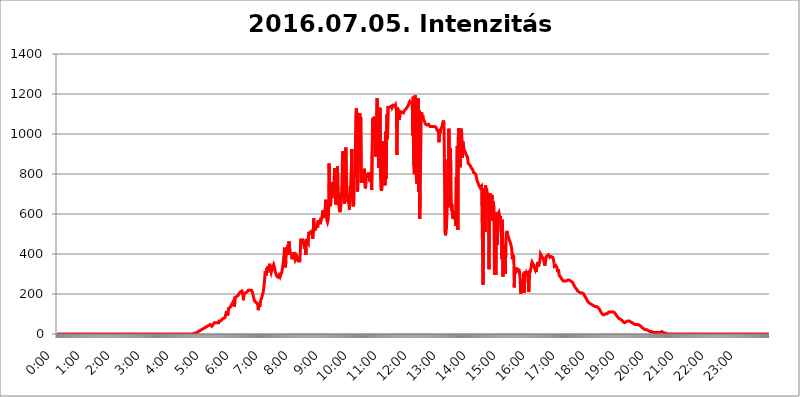
| Category | 2016.07.05. Intenzitás [W/m^2] |
|---|---|
| 0.0 | 0 |
| 0.0006944444444444445 | 0 |
| 0.001388888888888889 | 0 |
| 0.0020833333333333333 | 0 |
| 0.002777777777777778 | 0 |
| 0.003472222222222222 | 0 |
| 0.004166666666666667 | 0 |
| 0.004861111111111111 | 0 |
| 0.005555555555555556 | 0 |
| 0.0062499999999999995 | 0 |
| 0.006944444444444444 | 0 |
| 0.007638888888888889 | 0 |
| 0.008333333333333333 | 0 |
| 0.009027777777777779 | 0 |
| 0.009722222222222222 | 0 |
| 0.010416666666666666 | 0 |
| 0.011111111111111112 | 0 |
| 0.011805555555555555 | 0 |
| 0.012499999999999999 | 0 |
| 0.013194444444444444 | 0 |
| 0.013888888888888888 | 0 |
| 0.014583333333333332 | 0 |
| 0.015277777777777777 | 0 |
| 0.015972222222222224 | 0 |
| 0.016666666666666666 | 0 |
| 0.017361111111111112 | 0 |
| 0.018055555555555557 | 0 |
| 0.01875 | 0 |
| 0.019444444444444445 | 0 |
| 0.02013888888888889 | 0 |
| 0.020833333333333332 | 0 |
| 0.02152777777777778 | 0 |
| 0.022222222222222223 | 0 |
| 0.02291666666666667 | 0 |
| 0.02361111111111111 | 0 |
| 0.024305555555555556 | 0 |
| 0.024999999999999998 | 0 |
| 0.025694444444444447 | 0 |
| 0.02638888888888889 | 0 |
| 0.027083333333333334 | 0 |
| 0.027777777777777776 | 0 |
| 0.02847222222222222 | 0 |
| 0.029166666666666664 | 0 |
| 0.029861111111111113 | 0 |
| 0.030555555555555555 | 0 |
| 0.03125 | 0 |
| 0.03194444444444445 | 0 |
| 0.03263888888888889 | 0 |
| 0.03333333333333333 | 0 |
| 0.034027777777777775 | 0 |
| 0.034722222222222224 | 0 |
| 0.035416666666666666 | 0 |
| 0.036111111111111115 | 0 |
| 0.03680555555555556 | 0 |
| 0.0375 | 0 |
| 0.03819444444444444 | 0 |
| 0.03888888888888889 | 0 |
| 0.03958333333333333 | 0 |
| 0.04027777777777778 | 0 |
| 0.04097222222222222 | 0 |
| 0.041666666666666664 | 0 |
| 0.042361111111111106 | 0 |
| 0.04305555555555556 | 0 |
| 0.043750000000000004 | 0 |
| 0.044444444444444446 | 0 |
| 0.04513888888888889 | 0 |
| 0.04583333333333334 | 0 |
| 0.04652777777777778 | 0 |
| 0.04722222222222222 | 0 |
| 0.04791666666666666 | 0 |
| 0.04861111111111111 | 0 |
| 0.049305555555555554 | 0 |
| 0.049999999999999996 | 0 |
| 0.05069444444444445 | 0 |
| 0.051388888888888894 | 0 |
| 0.052083333333333336 | 0 |
| 0.05277777777777778 | 0 |
| 0.05347222222222222 | 0 |
| 0.05416666666666667 | 0 |
| 0.05486111111111111 | 0 |
| 0.05555555555555555 | 0 |
| 0.05625 | 0 |
| 0.05694444444444444 | 0 |
| 0.057638888888888885 | 0 |
| 0.05833333333333333 | 0 |
| 0.05902777777777778 | 0 |
| 0.059722222222222225 | 0 |
| 0.06041666666666667 | 0 |
| 0.061111111111111116 | 0 |
| 0.06180555555555556 | 0 |
| 0.0625 | 0 |
| 0.06319444444444444 | 0 |
| 0.06388888888888888 | 0 |
| 0.06458333333333334 | 0 |
| 0.06527777777777778 | 0 |
| 0.06597222222222222 | 0 |
| 0.06666666666666667 | 0 |
| 0.06736111111111111 | 0 |
| 0.06805555555555555 | 0 |
| 0.06874999999999999 | 0 |
| 0.06944444444444443 | 0 |
| 0.07013888888888889 | 0 |
| 0.07083333333333333 | 0 |
| 0.07152777777777779 | 0 |
| 0.07222222222222223 | 0 |
| 0.07291666666666667 | 0 |
| 0.07361111111111111 | 0 |
| 0.07430555555555556 | 0 |
| 0.075 | 0 |
| 0.07569444444444444 | 0 |
| 0.0763888888888889 | 0 |
| 0.07708333333333334 | 0 |
| 0.07777777777777778 | 0 |
| 0.07847222222222222 | 0 |
| 0.07916666666666666 | 0 |
| 0.0798611111111111 | 0 |
| 0.08055555555555556 | 0 |
| 0.08125 | 0 |
| 0.08194444444444444 | 0 |
| 0.08263888888888889 | 0 |
| 0.08333333333333333 | 0 |
| 0.08402777777777777 | 0 |
| 0.08472222222222221 | 0 |
| 0.08541666666666665 | 0 |
| 0.08611111111111112 | 0 |
| 0.08680555555555557 | 0 |
| 0.08750000000000001 | 0 |
| 0.08819444444444445 | 0 |
| 0.08888888888888889 | 0 |
| 0.08958333333333333 | 0 |
| 0.09027777777777778 | 0 |
| 0.09097222222222222 | 0 |
| 0.09166666666666667 | 0 |
| 0.09236111111111112 | 0 |
| 0.09305555555555556 | 0 |
| 0.09375 | 0 |
| 0.09444444444444444 | 0 |
| 0.09513888888888888 | 0 |
| 0.09583333333333333 | 0 |
| 0.09652777777777777 | 0 |
| 0.09722222222222222 | 0 |
| 0.09791666666666667 | 0 |
| 0.09861111111111111 | 0 |
| 0.09930555555555555 | 0 |
| 0.09999999999999999 | 0 |
| 0.10069444444444443 | 0 |
| 0.1013888888888889 | 0 |
| 0.10208333333333335 | 0 |
| 0.10277777777777779 | 0 |
| 0.10347222222222223 | 0 |
| 0.10416666666666667 | 0 |
| 0.10486111111111111 | 0 |
| 0.10555555555555556 | 0 |
| 0.10625 | 0 |
| 0.10694444444444444 | 0 |
| 0.1076388888888889 | 0 |
| 0.10833333333333334 | 0 |
| 0.10902777777777778 | 0 |
| 0.10972222222222222 | 0 |
| 0.1111111111111111 | 0 |
| 0.11180555555555556 | 0 |
| 0.11180555555555556 | 0 |
| 0.1125 | 0 |
| 0.11319444444444444 | 0 |
| 0.11388888888888889 | 0 |
| 0.11458333333333333 | 0 |
| 0.11527777777777777 | 0 |
| 0.11597222222222221 | 0 |
| 0.11666666666666665 | 0 |
| 0.1173611111111111 | 0 |
| 0.11805555555555557 | 0 |
| 0.11944444444444445 | 0 |
| 0.12013888888888889 | 0 |
| 0.12083333333333333 | 0 |
| 0.12152777777777778 | 0 |
| 0.12222222222222223 | 0 |
| 0.12291666666666667 | 0 |
| 0.12291666666666667 | 0 |
| 0.12361111111111112 | 0 |
| 0.12430555555555556 | 0 |
| 0.125 | 0 |
| 0.12569444444444444 | 0 |
| 0.12638888888888888 | 0 |
| 0.12708333333333333 | 0 |
| 0.16875 | 0 |
| 0.12847222222222224 | 0 |
| 0.12916666666666668 | 0 |
| 0.12986111111111112 | 0 |
| 0.13055555555555556 | 0 |
| 0.13125 | 0 |
| 0.13194444444444445 | 0 |
| 0.1326388888888889 | 0 |
| 0.13333333333333333 | 0 |
| 0.13402777777777777 | 0 |
| 0.13402777777777777 | 0 |
| 0.13472222222222222 | 0 |
| 0.13541666666666666 | 0 |
| 0.1361111111111111 | 0 |
| 0.13749999999999998 | 0 |
| 0.13819444444444443 | 0 |
| 0.1388888888888889 | 0 |
| 0.13958333333333334 | 0 |
| 0.14027777777777778 | 0 |
| 0.14097222222222222 | 0 |
| 0.14166666666666666 | 0 |
| 0.1423611111111111 | 0 |
| 0.14305555555555557 | 0 |
| 0.14375000000000002 | 0 |
| 0.14444444444444446 | 0 |
| 0.1451388888888889 | 0 |
| 0.1451388888888889 | 0 |
| 0.14652777777777778 | 0 |
| 0.14722222222222223 | 0 |
| 0.14791666666666667 | 0 |
| 0.1486111111111111 | 0 |
| 0.14930555555555555 | 0 |
| 0.15 | 0 |
| 0.15069444444444444 | 0 |
| 0.15138888888888888 | 0 |
| 0.15208333333333332 | 0 |
| 0.15277777777777776 | 0 |
| 0.15347222222222223 | 0 |
| 0.15416666666666667 | 0 |
| 0.15486111111111112 | 0 |
| 0.15555555555555556 | 0 |
| 0.15625 | 0 |
| 0.15694444444444444 | 0 |
| 0.15763888888888888 | 0 |
| 0.15833333333333333 | 0 |
| 0.15902777777777777 | 0 |
| 0.15972222222222224 | 0 |
| 0.16041666666666668 | 0 |
| 0.16111111111111112 | 0 |
| 0.16180555555555556 | 0 |
| 0.1625 | 0 |
| 0.16319444444444445 | 0 |
| 0.1638888888888889 | 0 |
| 0.16458333333333333 | 0 |
| 0.16527777777777777 | 0 |
| 0.16597222222222222 | 0 |
| 0.16666666666666666 | 0 |
| 0.1673611111111111 | 0 |
| 0.16805555555555554 | 0 |
| 0.16874999999999998 | 0 |
| 0.16944444444444443 | 0 |
| 0.17013888888888887 | 0 |
| 0.1708333333333333 | 0 |
| 0.17152777777777775 | 0 |
| 0.17222222222222225 | 0 |
| 0.1729166666666667 | 0 |
| 0.17361111111111113 | 0 |
| 0.17430555555555557 | 0 |
| 0.17500000000000002 | 0 |
| 0.17569444444444446 | 0 |
| 0.1763888888888889 | 0 |
| 0.17708333333333334 | 0 |
| 0.17777777777777778 | 0 |
| 0.17847222222222223 | 0 |
| 0.17916666666666667 | 0 |
| 0.1798611111111111 | 0 |
| 0.18055555555555555 | 0 |
| 0.18125 | 0 |
| 0.18194444444444444 | 0 |
| 0.1826388888888889 | 0 |
| 0.18333333333333335 | 0 |
| 0.1840277777777778 | 0 |
| 0.18472222222222223 | 0 |
| 0.18541666666666667 | 0 |
| 0.18611111111111112 | 0 |
| 0.18680555555555556 | 0 |
| 0.1875 | 0 |
| 0.18819444444444444 | 0 |
| 0.18888888888888888 | 0 |
| 0.18958333333333333 | 0 |
| 0.19027777777777777 | 3.525 |
| 0.1909722222222222 | 3.525 |
| 0.19166666666666665 | 3.525 |
| 0.19236111111111112 | 3.525 |
| 0.19305555555555554 | 3.525 |
| 0.19375 | 3.525 |
| 0.19444444444444445 | 7.887 |
| 0.1951388888888889 | 7.887 |
| 0.19583333333333333 | 7.887 |
| 0.19652777777777777 | 7.887 |
| 0.19722222222222222 | 7.887 |
| 0.19791666666666666 | 12.257 |
| 0.1986111111111111 | 12.257 |
| 0.19930555555555554 | 12.257 |
| 0.19999999999999998 | 16.636 |
| 0.20069444444444443 | 16.636 |
| 0.20138888888888887 | 21.024 |
| 0.2020833333333333 | 21.024 |
| 0.2027777777777778 | 21.024 |
| 0.2034722222222222 | 21.024 |
| 0.2041666666666667 | 25.419 |
| 0.20486111111111113 | 25.419 |
| 0.20555555555555557 | 29.823 |
| 0.20625000000000002 | 29.823 |
| 0.20694444444444446 | 34.234 |
| 0.2076388888888889 | 34.234 |
| 0.20833333333333334 | 34.234 |
| 0.20902777777777778 | 38.653 |
| 0.20972222222222223 | 38.653 |
| 0.21041666666666667 | 38.653 |
| 0.2111111111111111 | 38.653 |
| 0.21180555555555555 | 43.079 |
| 0.2125 | 43.079 |
| 0.21319444444444444 | 43.079 |
| 0.2138888888888889 | 47.511 |
| 0.21458333333333335 | 47.511 |
| 0.2152777777777778 | 43.079 |
| 0.21597222222222223 | 43.079 |
| 0.21666666666666667 | 38.653 |
| 0.21736111111111112 | 43.079 |
| 0.21805555555555556 | 43.079 |
| 0.21875 | 47.511 |
| 0.21944444444444444 | 51.951 |
| 0.22013888888888888 | 56.398 |
| 0.22083333333333333 | 56.398 |
| 0.22152777777777777 | 56.398 |
| 0.2222222222222222 | 56.398 |
| 0.22291666666666665 | 56.398 |
| 0.2236111111111111 | 56.398 |
| 0.22430555555555556 | 56.398 |
| 0.225 | 56.398 |
| 0.22569444444444445 | 56.398 |
| 0.2263888888888889 | 56.398 |
| 0.22708333333333333 | 65.31 |
| 0.22777777777777777 | 60.85 |
| 0.22847222222222222 | 65.31 |
| 0.22916666666666666 | 65.31 |
| 0.2298611111111111 | 69.775 |
| 0.23055555555555554 | 69.775 |
| 0.23124999999999998 | 74.246 |
| 0.23194444444444443 | 74.246 |
| 0.23263888888888887 | 74.246 |
| 0.2333333333333333 | 78.722 |
| 0.2340277777777778 | 78.722 |
| 0.2347222222222222 | 78.722 |
| 0.2354166666666667 | 83.205 |
| 0.23611111111111113 | 83.205 |
| 0.23680555555555557 | 105.69 |
| 0.23750000000000002 | 114.716 |
| 0.23819444444444446 | 114.716 |
| 0.2388888888888889 | 92.184 |
| 0.23958333333333334 | 101.184 |
| 0.24027777777777778 | 128.284 |
| 0.24097222222222223 | 128.284 |
| 0.24166666666666667 | 128.284 |
| 0.2423611111111111 | 132.814 |
| 0.24305555555555555 | 132.814 |
| 0.24375 | 141.884 |
| 0.24444444444444446 | 146.423 |
| 0.24513888888888888 | 150.964 |
| 0.24583333333333335 | 155.509 |
| 0.2465277777777778 | 160.056 |
| 0.24722222222222223 | 155.509 |
| 0.24791666666666667 | 160.056 |
| 0.24861111111111112 | 137.347 |
| 0.24930555555555556 | 182.82 |
| 0.25 | 182.82 |
| 0.25069444444444444 | 187.378 |
| 0.2513888888888889 | 187.378 |
| 0.2520833333333333 | 191.937 |
| 0.25277777777777777 | 191.937 |
| 0.2534722222222222 | 191.937 |
| 0.25416666666666665 | 196.497 |
| 0.2548611111111111 | 201.058 |
| 0.2555555555555556 | 201.058 |
| 0.25625000000000003 | 205.62 |
| 0.2569444444444445 | 210.182 |
| 0.2576388888888889 | 214.746 |
| 0.25833333333333336 | 210.182 |
| 0.2590277777777778 | 214.746 |
| 0.25972222222222224 | 210.182 |
| 0.2604166666666667 | 191.937 |
| 0.2611111111111111 | 169.156 |
| 0.26180555555555557 | 201.058 |
| 0.2625 | 196.497 |
| 0.26319444444444445 | 205.62 |
| 0.2638888888888889 | 205.62 |
| 0.26458333333333334 | 201.058 |
| 0.2652777777777778 | 205.62 |
| 0.2659722222222222 | 210.182 |
| 0.26666666666666666 | 210.182 |
| 0.2673611111111111 | 214.746 |
| 0.26805555555555555 | 219.309 |
| 0.26875 | 219.309 |
| 0.26944444444444443 | 223.873 |
| 0.2701388888888889 | 219.309 |
| 0.2708333333333333 | 223.873 |
| 0.27152777777777776 | 219.309 |
| 0.2722222222222222 | 219.309 |
| 0.27291666666666664 | 214.746 |
| 0.2736111111111111 | 210.182 |
| 0.2743055555555555 | 201.058 |
| 0.27499999999999997 | 187.378 |
| 0.27569444444444446 | 178.264 |
| 0.27638888888888885 | 169.156 |
| 0.27708333333333335 | 164.605 |
| 0.2777777777777778 | 160.056 |
| 0.27847222222222223 | 155.509 |
| 0.2791666666666667 | 155.509 |
| 0.2798611111111111 | 155.509 |
| 0.28055555555555556 | 155.509 |
| 0.28125 | 146.423 |
| 0.28194444444444444 | 119.235 |
| 0.2826388888888889 | 123.758 |
| 0.2833333333333333 | 150.964 |
| 0.28402777777777777 | 137.347 |
| 0.2847222222222222 | 160.056 |
| 0.28541666666666665 | 169.156 |
| 0.28611111111111115 | 173.709 |
| 0.28680555555555554 | 182.82 |
| 0.28750000000000003 | 191.937 |
| 0.2881944444444445 | 201.058 |
| 0.2888888888888889 | 210.182 |
| 0.28958333333333336 | 228.436 |
| 0.2902777777777778 | 251.251 |
| 0.29097222222222224 | 278.603 |
| 0.2916666666666667 | 314.98 |
| 0.2923611111111111 | 305.898 |
| 0.29305555555555557 | 292.259 |
| 0.29375 | 328.584 |
| 0.29444444444444445 | 305.898 |
| 0.2951388888888889 | 337.639 |
| 0.29583333333333334 | 333.113 |
| 0.2965277777777778 | 314.98 |
| 0.2972222222222222 | 337.639 |
| 0.29791666666666666 | 351.198 |
| 0.2986111111111111 | 346.682 |
| 0.29930555555555555 | 314.98 |
| 0.3 | 305.898 |
| 0.30069444444444443 | 314.98 |
| 0.3013888888888889 | 324.052 |
| 0.3020833333333333 | 333.113 |
| 0.30277777777777776 | 333.113 |
| 0.3034722222222222 | 346.682 |
| 0.30416666666666664 | 342.162 |
| 0.3048611111111111 | 328.584 |
| 0.3055555555555555 | 324.052 |
| 0.30624999999999997 | 305.898 |
| 0.3069444444444444 | 296.808 |
| 0.3076388888888889 | 292.259 |
| 0.30833333333333335 | 287.709 |
| 0.3090277777777778 | 287.709 |
| 0.30972222222222223 | 283.156 |
| 0.3104166666666667 | 283.156 |
| 0.3111111111111111 | 287.709 |
| 0.31180555555555556 | 287.709 |
| 0.3125 | 305.898 |
| 0.31319444444444444 | 292.259 |
| 0.3138888888888889 | 296.808 |
| 0.3145833333333333 | 305.898 |
| 0.31527777777777777 | 314.98 |
| 0.3159722222222222 | 333.113 |
| 0.31666666666666665 | 346.682 |
| 0.31736111111111115 | 342.162 |
| 0.31805555555555554 | 396.164 |
| 0.31875000000000003 | 431.833 |
| 0.3194444444444445 | 342.162 |
| 0.3201388888888889 | 333.113 |
| 0.32083333333333336 | 405.108 |
| 0.3215277777777778 | 418.492 |
| 0.32222222222222224 | 427.39 |
| 0.3229166666666667 | 431.833 |
| 0.3236111111111111 | 445.129 |
| 0.32430555555555557 | 396.164 |
| 0.325 | 462.786 |
| 0.32569444444444445 | 462.786 |
| 0.3263888888888889 | 409.574 |
| 0.32708333333333334 | 414.035 |
| 0.3277777777777778 | 414.035 |
| 0.3284722222222222 | 396.164 |
| 0.32916666666666666 | 373.729 |
| 0.3298611111111111 | 369.23 |
| 0.33055555555555555 | 373.729 |
| 0.33125 | 391.685 |
| 0.33194444444444443 | 409.574 |
| 0.3326388888888889 | 405.108 |
| 0.3333333333333333 | 387.202 |
| 0.3340277777777778 | 369.23 |
| 0.3347222222222222 | 373.729 |
| 0.3354166666666667 | 378.224 |
| 0.3361111111111111 | 387.202 |
| 0.3368055555555556 | 387.202 |
| 0.33749999999999997 | 373.729 |
| 0.33819444444444446 | 364.728 |
| 0.33888888888888885 | 360.221 |
| 0.33958333333333335 | 369.23 |
| 0.34027777777777773 | 364.728 |
| 0.34097222222222223 | 364.728 |
| 0.3416666666666666 | 475.972 |
| 0.3423611111111111 | 449.551 |
| 0.3430555555555555 | 462.786 |
| 0.34375 | 475.972 |
| 0.3444444444444445 | 475.972 |
| 0.3451388888888889 | 471.582 |
| 0.3458333333333334 | 449.551 |
| 0.34652777777777777 | 427.39 |
| 0.34722222222222227 | 431.833 |
| 0.34791666666666665 | 462.786 |
| 0.34861111111111115 | 396.164 |
| 0.34930555555555554 | 475.972 |
| 0.35000000000000003 | 467.187 |
| 0.3506944444444444 | 467.187 |
| 0.3513888888888889 | 471.582 |
| 0.3520833333333333 | 453.968 |
| 0.3527777777777778 | 510.885 |
| 0.3534722222222222 | 502.192 |
| 0.3541666666666667 | 502.192 |
| 0.3548611111111111 | 506.542 |
| 0.35555555555555557 | 510.885 |
| 0.35625 | 510.885 |
| 0.35694444444444445 | 515.223 |
| 0.3576388888888889 | 493.475 |
| 0.35833333333333334 | 475.972 |
| 0.3590277777777778 | 515.223 |
| 0.3597222222222222 | 579.542 |
| 0.36041666666666666 | 519.555 |
| 0.3611111111111111 | 515.223 |
| 0.36180555555555555 | 523.88 |
| 0.3625 | 523.88 |
| 0.36319444444444443 | 536.82 |
| 0.3638888888888889 | 532.513 |
| 0.3645833333333333 | 545.416 |
| 0.3652777777777778 | 532.513 |
| 0.3659722222222222 | 566.793 |
| 0.3666666666666667 | 549.704 |
| 0.3673611111111111 | 549.704 |
| 0.3680555555555556 | 562.53 |
| 0.36874999999999997 | 549.704 |
| 0.36944444444444446 | 558.261 |
| 0.37013888888888885 | 553.986 |
| 0.37083333333333335 | 562.53 |
| 0.37152777777777773 | 588.009 |
| 0.37222222222222223 | 617.436 |
| 0.3729166666666666 | 600.661 |
| 0.3736111111111111 | 588.009 |
| 0.3743055555555555 | 579.542 |
| 0.375 | 604.864 |
| 0.3756944444444445 | 621.613 |
| 0.3763888888888889 | 671.22 |
| 0.3770833333333334 | 592.233 |
| 0.37777777777777777 | 583.779 |
| 0.37847222222222227 | 566.793 |
| 0.37916666666666665 | 558.261 |
| 0.37986111111111115 | 566.793 |
| 0.38055555555555554 | 604.864 |
| 0.38125000000000003 | 853.029 |
| 0.3819444444444444 | 679.395 |
| 0.3826388888888889 | 683.473 |
| 0.3833333333333333 | 638.256 |
| 0.3840277777777778 | 715.858 |
| 0.3847222222222222 | 691.608 |
| 0.3854166666666667 | 679.395 |
| 0.3861111111111111 | 759.723 |
| 0.38680555555555557 | 739.877 |
| 0.3875 | 723.889 |
| 0.38819444444444445 | 695.666 |
| 0.3888888888888889 | 829.981 |
| 0.38958333333333334 | 751.803 |
| 0.3902777777777778 | 663.019 |
| 0.3909722222222222 | 646.537 |
| 0.39166666666666666 | 787.258 |
| 0.3923611111111111 | 739.877 |
| 0.39305555555555555 | 837.682 |
| 0.39375 | 715.858 |
| 0.39444444444444443 | 699.717 |
| 0.3951388888888889 | 642.4 |
| 0.3958333333333333 | 617.436 |
| 0.3965277777777778 | 609.062 |
| 0.3972222222222222 | 625.784 |
| 0.3979166666666667 | 642.4 |
| 0.3986111111111111 | 691.608 |
| 0.3993055555555556 | 743.859 |
| 0.39999999999999997 | 894.885 |
| 0.40069444444444446 | 913.766 |
| 0.40138888888888885 | 767.62 |
| 0.40208333333333335 | 695.666 |
| 0.40277777777777773 | 650.667 |
| 0.40347222222222223 | 719.877 |
| 0.4041666666666666 | 913.766 |
| 0.4048611111111111 | 932.576 |
| 0.4055555555555555 | 775.492 |
| 0.40625 | 719.877 |
| 0.4069444444444445 | 695.666 |
| 0.4076388888888889 | 658.909 |
| 0.4083333333333334 | 671.22 |
| 0.40902777777777777 | 650.667 |
| 0.40972222222222227 | 621.613 |
| 0.41041666666666665 | 658.909 |
| 0.41111111111111115 | 739.877 |
| 0.41180555555555554 | 723.889 |
| 0.41250000000000003 | 727.896 |
| 0.4131944444444444 | 925.06 |
| 0.4138888888888889 | 679.395 |
| 0.4145833333333333 | 687.544 |
| 0.4152777777777778 | 638.256 |
| 0.4159722222222222 | 650.667 |
| 0.4166666666666667 | 779.42 |
| 0.4173611111111111 | 802.868 |
| 0.41805555555555557 | 868.305 |
| 0.41875 | 1089.873 |
| 0.41944444444444445 | 1127.879 |
| 0.4201388888888889 | 1101.226 |
| 0.42083333333333334 | 711.832 |
| 0.4215277777777778 | 723.889 |
| 0.4222222222222222 | 822.26 |
| 0.42291666666666666 | 970.034 |
| 0.4236111111111111 | 1052.255 |
| 0.42430555555555555 | 1105.019 |
| 0.425 | 1056.004 |
| 0.42569444444444443 | 1082.324 |
| 0.4263888888888889 | 755.766 |
| 0.4270833333333333 | 810.641 |
| 0.4277777777777778 | 763.674 |
| 0.4284722222222222 | 798.974 |
| 0.4291666666666667 | 771.559 |
| 0.4298611111111111 | 755.766 |
| 0.4305555555555556 | 826.123 |
| 0.43124999999999997 | 763.674 |
| 0.43194444444444446 | 727.896 |
| 0.43263888888888885 | 735.89 |
| 0.43333333333333335 | 779.42 |
| 0.43402777777777773 | 779.42 |
| 0.43472222222222223 | 802.868 |
| 0.4354166666666666 | 802.868 |
| 0.4361111111111111 | 783.342 |
| 0.4368055555555555 | 806.757 |
| 0.4375 | 791.169 |
| 0.4381944444444445 | 767.62 |
| 0.4388888888888889 | 759.723 |
| 0.4395833333333334 | 759.723 |
| 0.44027777777777777 | 810.641 |
| 0.44097222222222227 | 719.877 |
| 0.44166666666666665 | 913.766 |
| 0.44236111111111115 | 1078.555 |
| 0.44305555555555554 | 999.916 |
| 0.44375000000000003 | 977.508 |
| 0.4444444444444444 | 1086.097 |
| 0.4451388888888889 | 1082.324 |
| 0.4458333333333333 | 925.06 |
| 0.4465277777777778 | 887.309 |
| 0.4472222222222222 | 1014.852 |
| 0.4479166666666667 | 1014.852 |
| 0.4486111111111111 | 1178.177 |
| 0.44930555555555557 | 1048.508 |
| 0.45 | 970.034 |
| 0.45069444444444445 | 829.981 |
| 0.4513888888888889 | 913.766 |
| 0.45208333333333334 | 1078.555 |
| 0.4527777777777778 | 1131.708 |
| 0.4534722222222222 | 783.342 |
| 0.45416666666666666 | 723.889 |
| 0.4548611111111111 | 715.858 |
| 0.45555555555555555 | 751.803 |
| 0.45625 | 940.082 |
| 0.45694444444444443 | 962.555 |
| 0.4576388888888889 | 936.33 |
| 0.4583333333333333 | 802.868 |
| 0.4590277777777778 | 902.447 |
| 0.4597222222222222 | 743.859 |
| 0.4604166666666667 | 1011.118 |
| 0.4611111111111111 | 775.492 |
| 0.4618055555555556 | 1029.798 |
| 0.46249999999999997 | 1097.437 |
| 0.46319444444444446 | 973.772 |
| 0.46388888888888885 | 1139.384 |
| 0.46458333333333335 | 1131.708 |
| 0.46527777777777773 | 1131.708 |
| 0.46597222222222223 | 1131.708 |
| 0.4666666666666666 | 1135.543 |
| 0.4673611111111111 | 1135.543 |
| 0.4680555555555555 | 1139.384 |
| 0.46875 | 1139.384 |
| 0.4694444444444445 | 1131.708 |
| 0.4701388888888889 | 1135.543 |
| 0.4708333333333334 | 1143.232 |
| 0.47152777777777777 | 1139.384 |
| 0.47222222222222227 | 1143.232 |
| 0.47291666666666665 | 1139.384 |
| 0.47361111111111115 | 1135.543 |
| 0.47430555555555554 | 1147.086 |
| 0.47500000000000003 | 1143.232 |
| 0.4756944444444444 | 1116.426 |
| 0.4763888888888889 | 894.885 |
| 0.4770833333333333 | 1131.708 |
| 0.4777777777777778 | 1124.056 |
| 0.4784722222222222 | 1116.426 |
| 0.4791666666666667 | 1116.426 |
| 0.4798611111111111 | 1071.027 |
| 0.48055555555555557 | 1101.226 |
| 0.48125 | 1112.618 |
| 0.48194444444444445 | 1112.618 |
| 0.4826388888888889 | 1108.816 |
| 0.48333333333333334 | 1108.816 |
| 0.4840277777777778 | 1108.816 |
| 0.4847222222222222 | 1108.816 |
| 0.48541666666666666 | 1105.019 |
| 0.4861111111111111 | 1108.816 |
| 0.48680555555555555 | 1116.426 |
| 0.4875 | 1116.426 |
| 0.48819444444444443 | 1116.426 |
| 0.4888888888888889 | 1124.056 |
| 0.4895833333333333 | 1124.056 |
| 0.4902777777777778 | 1127.879 |
| 0.4909722222222222 | 1135.543 |
| 0.4916666666666667 | 1139.384 |
| 0.4923611111111111 | 1143.232 |
| 0.4930555555555556 | 1150.946 |
| 0.49374999999999997 | 1154.814 |
| 0.49444444444444446 | 1162.571 |
| 0.49513888888888885 | 1162.571 |
| 0.49583333333333335 | 1154.814 |
| 0.49652777777777773 | 1158.689 |
| 0.49722222222222223 | 1150.946 |
| 0.4979166666666666 | 1154.814 |
| 0.4986111111111111 | 992.448 |
| 0.4993055555555555 | 1186.03 |
| 0.5 | 845.365 |
| 0.5006944444444444 | 798.974 |
| 0.5013888888888889 | 826.123 |
| 0.5020833333333333 | 1193.918 |
| 0.5027777777777778 | 1089.873 |
| 0.5034722222222222 | 791.169 |
| 0.5041666666666667 | 751.803 |
| 0.5048611111111111 | 977.508 |
| 0.5055555555555555 | 1067.267 |
| 0.50625 | 1178.177 |
| 0.5069444444444444 | 711.832 |
| 0.5076388888888889 | 1120.238 |
| 0.5083333333333333 | 575.299 |
| 0.5090277777777777 | 695.666 |
| 0.5097222222222222 | 695.666 |
| 0.5104166666666666 | 1097.437 |
| 0.5111111111111112 | 1108.816 |
| 0.5118055555555555 | 1078.555 |
| 0.5125000000000001 | 1093.653 |
| 0.5131944444444444 | 1078.555 |
| 0.513888888888889 | 1071.027 |
| 0.5145833333333333 | 1067.267 |
| 0.5152777777777778 | 1059.756 |
| 0.5159722222222222 | 1056.004 |
| 0.5166666666666667 | 1048.508 |
| 0.517361111111111 | 1048.508 |
| 0.5180555555555556 | 1044.762 |
| 0.5187499999999999 | 1044.762 |
| 0.5194444444444445 | 1044.762 |
| 0.5201388888888888 | 1048.508 |
| 0.5208333333333334 | 1048.508 |
| 0.5215277777777778 | 1048.508 |
| 0.5222222222222223 | 1044.762 |
| 0.5229166666666667 | 1037.277 |
| 0.5236111111111111 | 1033.537 |
| 0.5243055555555556 | 1037.277 |
| 0.525 | 1037.277 |
| 0.5256944444444445 | 1037.277 |
| 0.5263888888888889 | 1037.277 |
| 0.5270833333333333 | 1037.277 |
| 0.5277777777777778 | 1037.277 |
| 0.5284722222222222 | 1037.277 |
| 0.5291666666666667 | 1037.277 |
| 0.5298611111111111 | 1037.277 |
| 0.5305555555555556 | 1037.277 |
| 0.53125 | 1033.537 |
| 0.5319444444444444 | 1029.798 |
| 0.5326388888888889 | 1018.587 |
| 0.5333333333333333 | 1018.587 |
| 0.5340277777777778 | 1022.323 |
| 0.5347222222222222 | 1018.587 |
| 0.5354166666666667 | 958.814 |
| 0.5361111111111111 | 1014.852 |
| 0.5368055555555555 | 1003.65 |
| 0.5375 | 1018.587 |
| 0.5381944444444444 | 1026.06 |
| 0.5388888888888889 | 1029.798 |
| 0.5395833333333333 | 1037.277 |
| 0.5402777777777777 | 1048.508 |
| 0.5409722222222222 | 1059.756 |
| 0.5416666666666666 | 1067.267 |
| 0.5423611111111112 | 1052.255 |
| 0.5430555555555555 | 868.305 |
| 0.5437500000000001 | 515.223 |
| 0.5444444444444444 | 493.475 |
| 0.545138888888889 | 510.885 |
| 0.5458333333333333 | 528.2 |
| 0.5465277777777778 | 592.233 |
| 0.5472222222222222 | 675.311 |
| 0.5479166666666667 | 872.114 |
| 0.548611111111111 | 634.105 |
| 0.5493055555555556 | 1026.06 |
| 0.5499999999999999 | 687.544 |
| 0.5506944444444445 | 658.909 |
| 0.5513888888888888 | 928.819 |
| 0.5520833333333334 | 802.868 |
| 0.5527777777777778 | 617.436 |
| 0.5534722222222223 | 650.667 |
| 0.5541666666666667 | 609.062 |
| 0.5548611111111111 | 575.299 |
| 0.5555555555555556 | 592.233 |
| 0.55625 | 613.252 |
| 0.5569444444444445 | 592.233 |
| 0.5576388888888889 | 609.062 |
| 0.5583333333333333 | 571.049 |
| 0.5590277777777778 | 541.121 |
| 0.5597222222222222 | 783.342 |
| 0.5604166666666667 | 743.859 |
| 0.5611111111111111 | 940.082 |
| 0.5618055555555556 | 519.555 |
| 0.5625 | 984.98 |
| 0.5631944444444444 | 1029.798 |
| 0.5638888888888889 | 1029.798 |
| 0.5645833333333333 | 1033.537 |
| 0.5652777777777778 | 833.834 |
| 0.5659722222222222 | 1026.06 |
| 0.5666666666666667 | 1018.587 |
| 0.5673611111111111 | 1003.65 |
| 0.5680555555555555 | 879.719 |
| 0.56875 | 962.555 |
| 0.5694444444444444 | 951.327 |
| 0.5701388888888889 | 932.576 |
| 0.5708333333333333 | 917.534 |
| 0.5715277777777777 | 917.534 |
| 0.5722222222222222 | 909.996 |
| 0.5729166666666666 | 902.447 |
| 0.5736111111111112 | 894.885 |
| 0.5743055555555555 | 891.099 |
| 0.5750000000000001 | 887.309 |
| 0.5756944444444444 | 875.918 |
| 0.576388888888889 | 853.029 |
| 0.5770833333333333 | 856.855 |
| 0.5777777777777778 | 849.199 |
| 0.5784722222222222 | 845.365 |
| 0.5791666666666667 | 841.526 |
| 0.579861111111111 | 837.682 |
| 0.5805555555555556 | 829.981 |
| 0.5812499999999999 | 829.981 |
| 0.5819444444444445 | 826.123 |
| 0.5826388888888888 | 822.26 |
| 0.5833333333333334 | 814.519 |
| 0.5840277777777778 | 806.757 |
| 0.5847222222222223 | 802.868 |
| 0.5854166666666667 | 802.868 |
| 0.5861111111111111 | 802.868 |
| 0.5868055555555556 | 798.974 |
| 0.5875 | 791.169 |
| 0.5881944444444445 | 779.42 |
| 0.5888888888888889 | 767.62 |
| 0.5895833333333333 | 759.723 |
| 0.5902777777777778 | 755.766 |
| 0.5909722222222222 | 747.834 |
| 0.5916666666666667 | 739.877 |
| 0.5923611111111111 | 735.89 |
| 0.5930555555555556 | 731.896 |
| 0.59375 | 727.896 |
| 0.5944444444444444 | 735.89 |
| 0.5951388888888889 | 739.877 |
| 0.5958333333333333 | 739.877 |
| 0.5965277777777778 | 739.877 |
| 0.5972222222222222 | 246.689 |
| 0.5979166666666667 | 642.4 |
| 0.5986111111111111 | 719.877 |
| 0.5993055555555555 | 727.896 |
| 0.6 | 510.885 |
| 0.6006944444444444 | 743.859 |
| 0.6013888888888889 | 719.877 |
| 0.6020833333333333 | 727.896 |
| 0.6027777777777777 | 703.762 |
| 0.6034722222222222 | 679.395 |
| 0.6041666666666666 | 703.762 |
| 0.6048611111111112 | 600.661 |
| 0.6055555555555555 | 324.052 |
| 0.6062500000000001 | 695.666 |
| 0.6069444444444444 | 703.762 |
| 0.607638888888889 | 703.762 |
| 0.6083333333333333 | 699.717 |
| 0.6090277777777778 | 596.45 |
| 0.6097222222222222 | 695.666 |
| 0.6104166666666667 | 566.793 |
| 0.611111111111111 | 663.019 |
| 0.6118055555555556 | 646.537 |
| 0.6124999999999999 | 638.256 |
| 0.6131944444444445 | 296.808 |
| 0.6138888888888888 | 471.582 |
| 0.6145833333333334 | 328.584 |
| 0.6152777777777778 | 296.808 |
| 0.6159722222222223 | 609.062 |
| 0.6166666666666667 | 613.252 |
| 0.6173611111111111 | 445.129 |
| 0.6180555555555556 | 600.661 |
| 0.61875 | 604.864 |
| 0.6194444444444445 | 609.062 |
| 0.6201388888888889 | 609.062 |
| 0.6208333333333333 | 579.542 |
| 0.6215277777777778 | 588.009 |
| 0.6222222222222222 | 588.009 |
| 0.6229166666666667 | 506.542 |
| 0.6236111111111111 | 373.729 |
| 0.6243055555555556 | 571.049 |
| 0.625 | 287.709 |
| 0.6256944444444444 | 287.709 |
| 0.6263888888888889 | 378.224 |
| 0.6270833333333333 | 396.164 |
| 0.6277777777777778 | 440.702 |
| 0.6284722222222222 | 301.354 |
| 0.6291666666666667 | 449.551 |
| 0.6298611111111111 | 506.542 |
| 0.6305555555555555 | 515.223 |
| 0.63125 | 510.885 |
| 0.6319444444444444 | 493.475 |
| 0.6326388888888889 | 484.735 |
| 0.6333333333333333 | 480.356 |
| 0.6340277777777777 | 471.582 |
| 0.6347222222222222 | 462.786 |
| 0.6354166666666666 | 458.38 |
| 0.6361111111111112 | 449.551 |
| 0.6368055555555555 | 436.27 |
| 0.6375000000000001 | 422.943 |
| 0.6381944444444444 | 373.729 |
| 0.638888888888889 | 396.164 |
| 0.6395833333333333 | 391.685 |
| 0.6402777777777778 | 387.202 |
| 0.6409722222222222 | 233 |
| 0.6416666666666667 | 319.517 |
| 0.642361111111111 | 333.113 |
| 0.6430555555555556 | 324.052 |
| 0.6437499999999999 | 319.517 |
| 0.6444444444444445 | 314.98 |
| 0.6451388888888888 | 319.517 |
| 0.6458333333333334 | 324.052 |
| 0.6465277777777778 | 324.052 |
| 0.6472222222222223 | 324.052 |
| 0.6479166666666667 | 319.517 |
| 0.6486111111111111 | 314.98 |
| 0.6493055555555556 | 274.047 |
| 0.65 | 201.058 |
| 0.6506944444444445 | 264.932 |
| 0.6513888888888889 | 223.873 |
| 0.6520833333333333 | 269.49 |
| 0.6527777777777778 | 210.182 |
| 0.6534722222222222 | 205.62 |
| 0.6541666666666667 | 305.898 |
| 0.6548611111111111 | 205.62 |
| 0.6555555555555556 | 255.813 |
| 0.65625 | 314.98 |
| 0.6569444444444444 | 301.354 |
| 0.6576388888888889 | 292.259 |
| 0.6583333333333333 | 305.898 |
| 0.6590277777777778 | 310.44 |
| 0.6597222222222222 | 296.808 |
| 0.6604166666666667 | 314.98 |
| 0.6611111111111111 | 210.182 |
| 0.6618055555555555 | 219.309 |
| 0.6625 | 319.517 |
| 0.6631944444444444 | 310.44 |
| 0.6638888888888889 | 319.517 |
| 0.6645833333333333 | 333.113 |
| 0.6652777777777777 | 351.198 |
| 0.6659722222222222 | 360.221 |
| 0.6666666666666666 | 360.221 |
| 0.6673611111111111 | 355.712 |
| 0.6680555555555556 | 346.682 |
| 0.6687500000000001 | 337.639 |
| 0.6694444444444444 | 342.162 |
| 0.6701388888888888 | 324.052 |
| 0.6708333333333334 | 337.639 |
| 0.6715277777777778 | 310.44 |
| 0.6722222222222222 | 319.517 |
| 0.6729166666666666 | 346.682 |
| 0.6736111111111112 | 346.682 |
| 0.6743055555555556 | 360.221 |
| 0.6749999999999999 | 337.639 |
| 0.6756944444444444 | 346.682 |
| 0.6763888888888889 | 351.198 |
| 0.6770833333333334 | 369.23 |
| 0.6777777777777777 | 400.638 |
| 0.6784722222222223 | 396.164 |
| 0.6791666666666667 | 391.685 |
| 0.6798611111111111 | 387.202 |
| 0.6805555555555555 | 382.715 |
| 0.68125 | 387.202 |
| 0.6819444444444445 | 373.729 |
| 0.6826388888888889 | 369.23 |
| 0.6833333333333332 | 351.198 |
| 0.6840277777777778 | 342.162 |
| 0.6847222222222222 | 346.682 |
| 0.6854166666666667 | 382.715 |
| 0.686111111111111 | 387.202 |
| 0.6868055555555556 | 391.685 |
| 0.6875 | 396.164 |
| 0.6881944444444444 | 396.164 |
| 0.688888888888889 | 396.164 |
| 0.6895833333333333 | 391.685 |
| 0.6902777777777778 | 396.164 |
| 0.6909722222222222 | 382.715 |
| 0.6916666666666668 | 387.202 |
| 0.6923611111111111 | 387.202 |
| 0.6930555555555555 | 387.202 |
| 0.69375 | 387.202 |
| 0.6944444444444445 | 387.202 |
| 0.6951388888888889 | 382.715 |
| 0.6958333333333333 | 373.729 |
| 0.6965277777777777 | 360.221 |
| 0.6972222222222223 | 337.639 |
| 0.6979166666666666 | 337.639 |
| 0.6986111111111111 | 337.639 |
| 0.6993055555555556 | 342.162 |
| 0.7000000000000001 | 337.639 |
| 0.7006944444444444 | 333.113 |
| 0.7013888888888888 | 324.052 |
| 0.7020833333333334 | 310.44 |
| 0.7027777777777778 | 324.052 |
| 0.7034722222222222 | 305.898 |
| 0.7041666666666666 | 292.259 |
| 0.7048611111111112 | 296.808 |
| 0.7055555555555556 | 287.709 |
| 0.7062499999999999 | 283.156 |
| 0.7069444444444444 | 278.603 |
| 0.7076388888888889 | 274.047 |
| 0.7083333333333334 | 269.49 |
| 0.7090277777777777 | 269.49 |
| 0.7097222222222223 | 264.932 |
| 0.7104166666666667 | 264.932 |
| 0.7111111111111111 | 264.932 |
| 0.7118055555555555 | 264.932 |
| 0.7125 | 264.932 |
| 0.7131944444444445 | 264.932 |
| 0.7138888888888889 | 264.932 |
| 0.7145833333333332 | 269.49 |
| 0.7152777777777778 | 269.49 |
| 0.7159722222222222 | 269.49 |
| 0.7166666666666667 | 269.49 |
| 0.717361111111111 | 269.49 |
| 0.7180555555555556 | 269.49 |
| 0.71875 | 264.932 |
| 0.7194444444444444 | 264.932 |
| 0.720138888888889 | 264.932 |
| 0.7208333333333333 | 264.932 |
| 0.7215277777777778 | 260.373 |
| 0.7222222222222222 | 260.373 |
| 0.7229166666666668 | 255.813 |
| 0.7236111111111111 | 251.251 |
| 0.7243055555555555 | 246.689 |
| 0.725 | 242.127 |
| 0.7256944444444445 | 237.564 |
| 0.7263888888888889 | 233 |
| 0.7270833333333333 | 228.436 |
| 0.7277777777777777 | 228.436 |
| 0.7284722222222223 | 223.873 |
| 0.7291666666666666 | 219.309 |
| 0.7298611111111111 | 214.746 |
| 0.7305555555555556 | 214.746 |
| 0.7312500000000001 | 210.182 |
| 0.7319444444444444 | 210.182 |
| 0.7326388888888888 | 210.182 |
| 0.7333333333333334 | 205.62 |
| 0.7340277777777778 | 205.62 |
| 0.7347222222222222 | 205.62 |
| 0.7354166666666666 | 205.62 |
| 0.7361111111111112 | 205.62 |
| 0.7368055555555556 | 205.62 |
| 0.7374999999999999 | 201.058 |
| 0.7381944444444444 | 201.058 |
| 0.7388888888888889 | 196.497 |
| 0.7395833333333334 | 191.937 |
| 0.7402777777777777 | 187.378 |
| 0.7409722222222223 | 182.82 |
| 0.7416666666666667 | 178.264 |
| 0.7423611111111111 | 173.709 |
| 0.7430555555555555 | 169.156 |
| 0.74375 | 164.605 |
| 0.7444444444444445 | 160.056 |
| 0.7451388888888889 | 160.056 |
| 0.7458333333333332 | 155.509 |
| 0.7465277777777778 | 155.509 |
| 0.7472222222222222 | 150.964 |
| 0.7479166666666667 | 150.964 |
| 0.748611111111111 | 146.423 |
| 0.7493055555555556 | 146.423 |
| 0.75 | 146.423 |
| 0.7506944444444444 | 146.423 |
| 0.751388888888889 | 141.884 |
| 0.7520833333333333 | 141.884 |
| 0.7527777777777778 | 141.884 |
| 0.7534722222222222 | 141.884 |
| 0.7541666666666668 | 137.347 |
| 0.7548611111111111 | 137.347 |
| 0.7555555555555555 | 137.347 |
| 0.75625 | 137.347 |
| 0.7569444444444445 | 137.347 |
| 0.7576388888888889 | 137.347 |
| 0.7583333333333333 | 132.814 |
| 0.7590277777777777 | 128.284 |
| 0.7597222222222223 | 128.284 |
| 0.7604166666666666 | 123.758 |
| 0.7611111111111111 | 119.235 |
| 0.7618055555555556 | 114.716 |
| 0.7625000000000001 | 110.201 |
| 0.7631944444444444 | 105.69 |
| 0.7638888888888888 | 105.69 |
| 0.7645833333333334 | 101.184 |
| 0.7652777777777778 | 96.682 |
| 0.7659722222222222 | 96.682 |
| 0.7666666666666666 | 96.682 |
| 0.7673611111111112 | 96.682 |
| 0.7680555555555556 | 96.682 |
| 0.7687499999999999 | 96.682 |
| 0.7694444444444444 | 101.184 |
| 0.7701388888888889 | 101.184 |
| 0.7708333333333334 | 101.184 |
| 0.7715277777777777 | 101.184 |
| 0.7722222222222223 | 105.69 |
| 0.7729166666666667 | 105.69 |
| 0.7736111111111111 | 110.201 |
| 0.7743055555555555 | 110.201 |
| 0.775 | 110.201 |
| 0.7756944444444445 | 110.201 |
| 0.7763888888888889 | 110.201 |
| 0.7770833333333332 | 110.201 |
| 0.7777777777777778 | 110.201 |
| 0.7784722222222222 | 110.201 |
| 0.7791666666666667 | 110.201 |
| 0.779861111111111 | 110.201 |
| 0.7805555555555556 | 110.201 |
| 0.78125 | 110.201 |
| 0.7819444444444444 | 105.69 |
| 0.782638888888889 | 101.184 |
| 0.7833333333333333 | 96.682 |
| 0.7840277777777778 | 92.184 |
| 0.7847222222222222 | 92.184 |
| 0.7854166666666668 | 87.692 |
| 0.7861111111111111 | 83.205 |
| 0.7868055555555555 | 83.205 |
| 0.7875 | 78.722 |
| 0.7881944444444445 | 78.722 |
| 0.7888888888888889 | 74.246 |
| 0.7895833333333333 | 74.246 |
| 0.7902777777777777 | 74.246 |
| 0.7909722222222223 | 69.775 |
| 0.7916666666666666 | 69.775 |
| 0.7923611111111111 | 65.31 |
| 0.7930555555555556 | 65.31 |
| 0.7937500000000001 | 60.85 |
| 0.7944444444444444 | 60.85 |
| 0.7951388888888888 | 56.398 |
| 0.7958333333333334 | 56.398 |
| 0.7965277777777778 | 60.85 |
| 0.7972222222222222 | 60.85 |
| 0.7979166666666666 | 60.85 |
| 0.7986111111111112 | 60.85 |
| 0.7993055555555556 | 65.31 |
| 0.7999999999999999 | 65.31 |
| 0.8006944444444444 | 65.31 |
| 0.8013888888888889 | 65.31 |
| 0.8020833333333334 | 65.31 |
| 0.8027777777777777 | 65.31 |
| 0.8034722222222223 | 65.31 |
| 0.8041666666666667 | 60.85 |
| 0.8048611111111111 | 60.85 |
| 0.8055555555555555 | 56.398 |
| 0.80625 | 56.398 |
| 0.8069444444444445 | 56.398 |
| 0.8076388888888889 | 51.951 |
| 0.8083333333333332 | 51.951 |
| 0.8090277777777778 | 47.511 |
| 0.8097222222222222 | 47.511 |
| 0.8104166666666667 | 47.511 |
| 0.811111111111111 | 47.511 |
| 0.8118055555555556 | 47.511 |
| 0.8125 | 47.511 |
| 0.8131944444444444 | 47.511 |
| 0.813888888888889 | 47.511 |
| 0.8145833333333333 | 47.511 |
| 0.8152777777777778 | 43.079 |
| 0.8159722222222222 | 43.079 |
| 0.8166666666666668 | 43.079 |
| 0.8173611111111111 | 43.079 |
| 0.8180555555555555 | 38.653 |
| 0.81875 | 38.653 |
| 0.8194444444444445 | 38.653 |
| 0.8201388888888889 | 34.234 |
| 0.8208333333333333 | 29.823 |
| 0.8215277777777777 | 29.823 |
| 0.8222222222222223 | 29.823 |
| 0.8229166666666666 | 25.419 |
| 0.8236111111111111 | 25.419 |
| 0.8243055555555556 | 25.419 |
| 0.8250000000000001 | 21.024 |
| 0.8256944444444444 | 21.024 |
| 0.8263888888888888 | 21.024 |
| 0.8270833333333334 | 21.024 |
| 0.8277777777777778 | 21.024 |
| 0.8284722222222222 | 16.636 |
| 0.8291666666666666 | 16.636 |
| 0.8298611111111112 | 16.636 |
| 0.8305555555555556 | 12.257 |
| 0.8312499999999999 | 12.257 |
| 0.8319444444444444 | 12.257 |
| 0.8326388888888889 | 12.257 |
| 0.8333333333333334 | 12.257 |
| 0.8340277777777777 | 12.257 |
| 0.8347222222222223 | 12.257 |
| 0.8354166666666667 | 7.887 |
| 0.8361111111111111 | 7.887 |
| 0.8368055555555555 | 7.887 |
| 0.8375 | 7.887 |
| 0.8381944444444445 | 7.887 |
| 0.8388888888888889 | 7.887 |
| 0.8395833333333332 | 7.887 |
| 0.8402777777777778 | 7.887 |
| 0.8409722222222222 | 7.887 |
| 0.8416666666666667 | 7.887 |
| 0.842361111111111 | 7.887 |
| 0.8430555555555556 | 7.887 |
| 0.84375 | 7.887 |
| 0.8444444444444444 | 7.887 |
| 0.845138888888889 | 7.887 |
| 0.8458333333333333 | 7.887 |
| 0.8465277777777778 | 7.887 |
| 0.8472222222222222 | 12.257 |
| 0.8479166666666668 | 12.257 |
| 0.8486111111111111 | 12.257 |
| 0.8493055555555555 | 7.887 |
| 0.85 | 7.887 |
| 0.8506944444444445 | 7.887 |
| 0.8513888888888889 | 7.887 |
| 0.8520833333333333 | 3.525 |
| 0.8527777777777777 | 3.525 |
| 0.8534722222222223 | 3.525 |
| 0.8541666666666666 | 3.525 |
| 0.8548611111111111 | 0 |
| 0.8555555555555556 | 0 |
| 0.8562500000000001 | 0 |
| 0.8569444444444444 | 0 |
| 0.8576388888888888 | 0 |
| 0.8583333333333334 | 0 |
| 0.8590277777777778 | 0 |
| 0.8597222222222222 | 0 |
| 0.8604166666666666 | 0 |
| 0.8611111111111112 | 0 |
| 0.8618055555555556 | 0 |
| 0.8624999999999999 | 0 |
| 0.8631944444444444 | 0 |
| 0.8638888888888889 | 0 |
| 0.8645833333333334 | 0 |
| 0.8652777777777777 | 0 |
| 0.8659722222222223 | 0 |
| 0.8666666666666667 | 0 |
| 0.8673611111111111 | 0 |
| 0.8680555555555555 | 0 |
| 0.86875 | 0 |
| 0.8694444444444445 | 0 |
| 0.8701388888888889 | 0 |
| 0.8708333333333332 | 0 |
| 0.8715277777777778 | 0 |
| 0.8722222222222222 | 0 |
| 0.8729166666666667 | 0 |
| 0.873611111111111 | 0 |
| 0.8743055555555556 | 0 |
| 0.875 | 0 |
| 0.8756944444444444 | 0 |
| 0.876388888888889 | 0 |
| 0.8770833333333333 | 0 |
| 0.8777777777777778 | 0 |
| 0.8784722222222222 | 0 |
| 0.8791666666666668 | 0 |
| 0.8798611111111111 | 0 |
| 0.8805555555555555 | 0 |
| 0.88125 | 0 |
| 0.8819444444444445 | 0 |
| 0.8826388888888889 | 0 |
| 0.8833333333333333 | 0 |
| 0.8840277777777777 | 0 |
| 0.8847222222222223 | 0 |
| 0.8854166666666666 | 0 |
| 0.8861111111111111 | 0 |
| 0.8868055555555556 | 0 |
| 0.8875000000000001 | 0 |
| 0.8881944444444444 | 0 |
| 0.8888888888888888 | 0 |
| 0.8895833333333334 | 0 |
| 0.8902777777777778 | 0 |
| 0.8909722222222222 | 0 |
| 0.8916666666666666 | 0 |
| 0.8923611111111112 | 0 |
| 0.8930555555555556 | 0 |
| 0.8937499999999999 | 0 |
| 0.8944444444444444 | 0 |
| 0.8951388888888889 | 0 |
| 0.8958333333333334 | 0 |
| 0.8965277777777777 | 0 |
| 0.8972222222222223 | 0 |
| 0.8979166666666667 | 0 |
| 0.8986111111111111 | 0 |
| 0.8993055555555555 | 0 |
| 0.9 | 0 |
| 0.9006944444444445 | 0 |
| 0.9013888888888889 | 0 |
| 0.9020833333333332 | 0 |
| 0.9027777777777778 | 0 |
| 0.9034722222222222 | 0 |
| 0.9041666666666667 | 0 |
| 0.904861111111111 | 0 |
| 0.9055555555555556 | 0 |
| 0.90625 | 0 |
| 0.9069444444444444 | 0 |
| 0.907638888888889 | 0 |
| 0.9083333333333333 | 0 |
| 0.9090277777777778 | 0 |
| 0.9097222222222222 | 0 |
| 0.9104166666666668 | 0 |
| 0.9111111111111111 | 0 |
| 0.9118055555555555 | 0 |
| 0.9125 | 0 |
| 0.9131944444444445 | 0 |
| 0.9138888888888889 | 0 |
| 0.9145833333333333 | 0 |
| 0.9152777777777777 | 0 |
| 0.9159722222222223 | 0 |
| 0.9166666666666666 | 0 |
| 0.9173611111111111 | 0 |
| 0.9180555555555556 | 0 |
| 0.9187500000000001 | 0 |
| 0.9194444444444444 | 0 |
| 0.9201388888888888 | 0 |
| 0.9208333333333334 | 0 |
| 0.9215277777777778 | 0 |
| 0.9222222222222222 | 0 |
| 0.9229166666666666 | 0 |
| 0.9236111111111112 | 0 |
| 0.9243055555555556 | 0 |
| 0.9249999999999999 | 0 |
| 0.9256944444444444 | 0 |
| 0.9263888888888889 | 0 |
| 0.9270833333333334 | 0 |
| 0.9277777777777777 | 0 |
| 0.9284722222222223 | 0 |
| 0.9291666666666667 | 0 |
| 0.9298611111111111 | 0 |
| 0.9305555555555555 | 0 |
| 0.93125 | 0 |
| 0.9319444444444445 | 0 |
| 0.9326388888888889 | 0 |
| 0.9333333333333332 | 0 |
| 0.9340277777777778 | 0 |
| 0.9347222222222222 | 0 |
| 0.9354166666666667 | 0 |
| 0.936111111111111 | 0 |
| 0.9368055555555556 | 0 |
| 0.9375 | 0 |
| 0.9381944444444444 | 0 |
| 0.938888888888889 | 0 |
| 0.9395833333333333 | 0 |
| 0.9402777777777778 | 0 |
| 0.9409722222222222 | 0 |
| 0.9416666666666668 | 0 |
| 0.9423611111111111 | 0 |
| 0.9430555555555555 | 0 |
| 0.94375 | 0 |
| 0.9444444444444445 | 0 |
| 0.9451388888888889 | 0 |
| 0.9458333333333333 | 0 |
| 0.9465277777777777 | 0 |
| 0.9472222222222223 | 0 |
| 0.9479166666666666 | 0 |
| 0.9486111111111111 | 0 |
| 0.9493055555555556 | 0 |
| 0.9500000000000001 | 0 |
| 0.9506944444444444 | 0 |
| 0.9513888888888888 | 0 |
| 0.9520833333333334 | 0 |
| 0.9527777777777778 | 0 |
| 0.9534722222222222 | 0 |
| 0.9541666666666666 | 0 |
| 0.9548611111111112 | 0 |
| 0.9555555555555556 | 0 |
| 0.9562499999999999 | 0 |
| 0.9569444444444444 | 0 |
| 0.9576388888888889 | 0 |
| 0.9583333333333334 | 0 |
| 0.9590277777777777 | 0 |
| 0.9597222222222223 | 0 |
| 0.9604166666666667 | 0 |
| 0.9611111111111111 | 0 |
| 0.9618055555555555 | 0 |
| 0.9625 | 0 |
| 0.9631944444444445 | 0 |
| 0.9638888888888889 | 0 |
| 0.9645833333333332 | 0 |
| 0.9652777777777778 | 0 |
| 0.9659722222222222 | 0 |
| 0.9666666666666667 | 0 |
| 0.967361111111111 | 0 |
| 0.9680555555555556 | 0 |
| 0.96875 | 0 |
| 0.9694444444444444 | 0 |
| 0.970138888888889 | 0 |
| 0.9708333333333333 | 0 |
| 0.9715277777777778 | 0 |
| 0.9722222222222222 | 0 |
| 0.9729166666666668 | 0 |
| 0.9736111111111111 | 0 |
| 0.9743055555555555 | 0 |
| 0.975 | 0 |
| 0.9756944444444445 | 0 |
| 0.9763888888888889 | 0 |
| 0.9770833333333333 | 0 |
| 0.9777777777777777 | 0 |
| 0.9784722222222223 | 0 |
| 0.9791666666666666 | 0 |
| 0.9798611111111111 | 0 |
| 0.9805555555555556 | 0 |
| 0.9812500000000001 | 0 |
| 0.9819444444444444 | 0 |
| 0.9826388888888888 | 0 |
| 0.9833333333333334 | 0 |
| 0.9840277777777778 | 0 |
| 0.9847222222222222 | 0 |
| 0.9854166666666666 | 0 |
| 0.9861111111111112 | 0 |
| 0.9868055555555556 | 0 |
| 0.9874999999999999 | 0 |
| 0.9881944444444444 | 0 |
| 0.9888888888888889 | 0 |
| 0.9895833333333334 | 0 |
| 0.9902777777777777 | 0 |
| 0.9909722222222223 | 0 |
| 0.9916666666666667 | 0 |
| 0.9923611111111111 | 0 |
| 0.9930555555555555 | 0 |
| 0.99375 | 0 |
| 0.9944444444444445 | 0 |
| 0.9951388888888889 | 0 |
| 0.9958333333333332 | 0 |
| 0.9965277777777778 | 0 |
| 0.9972222222222222 | 0 |
| 0.9979166666666667 | 0 |
| 0.998611111111111 | 0 |
| 0.9993055555555556 | 0 |